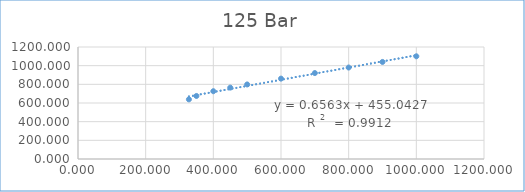
| Category | Series 0 |
|---|---|
| 327.8 | 638.868 |
| 350.0 | 675.251 |
| 400.0 | 726.23 |
| 450.0 | 764.787 |
| 500.0 | 798.758 |
| 600.0 | 861.108 |
| 700.0 | 920.831 |
| 800.0 | 980.124 |
| 900.0 | 1039.871 |
| 1000.0 | 1100.454 |